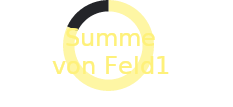
| Category | Ergebnis |
|---|---|
| Summe von Feld1 | 0.819 |
| Summe von Delta Ziel | 0.181 |